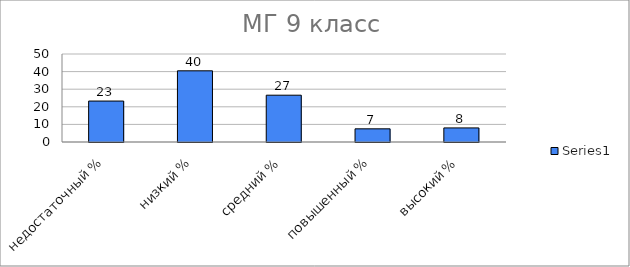
| Category | Series 0 |
|---|---|
| недостаточный % | 23.269 |
| низкий % | 40.443 |
| средний % | 26.593 |
| повышенный % | 7.479 |
| высокий % | 8 |